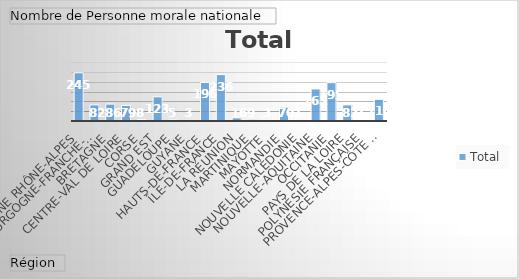
| Category | Total |
|---|---|
| Auvergne Rhône-Alpes | 245 |
| Bourgogne-Franche-Comté | 82 |
| Bretagne | 86 |
| Centre-Val de Loire | 79 |
| Corse | 8 |
| Grand Est | 123 |
| Guadeloupe | 5 |
| Guyane | 3 |
| Hauts-de-France | 196 |
| Île-de-France | 236 |
| La Réunion | 16 |
| Martinique | 9 |
| Mayotte | 3 |
| Normandie | 70 |
| Nouvelle Calédonie | 1 |
| Nouvelle-Aquitaine | 163 |
| Occitanie | 195 |
| Pays de la Loire | 82 |
| Polynésie Française | 1 |
| Provence-Alpes-Côte d'Azur | 110 |